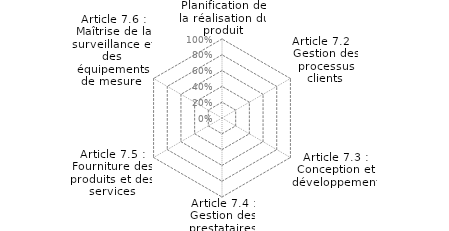
| Category | Article 7 : Réalisation du produit |
|---|---|
| Article 7.1 : Planification de la réalisation du produit | 0 |
| Article 7.2  : Gestion des processus clients | 0 |
| Article 7.3 : Conception et développement | 0 |
| Article 7.4 : Gestion des prestataires externes | 0 |
| Article 7.5 : Fourniture des produits et des services | 0 |
| Article 7.6 : Maîtrise de la surveillance et des équipements de mesure  | 0 |